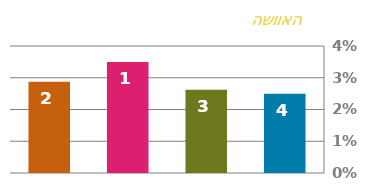
| Category | תעריף |
|---|---|
| 0 | 0.025 |
| 1 | 0.026 |
| 2 | 0.035 |
| 3 | 0.029 |